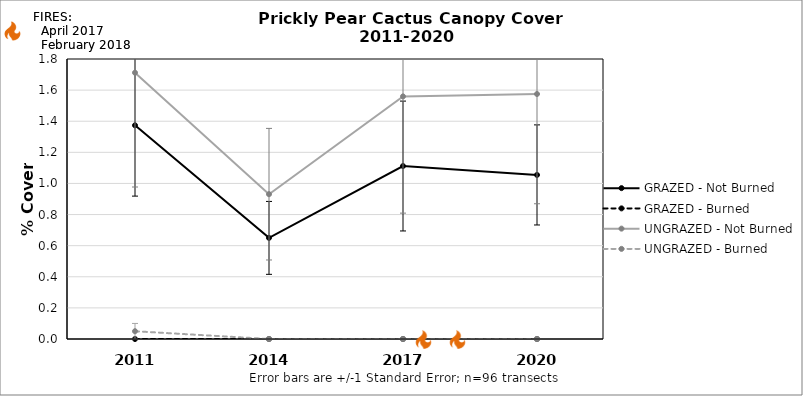
| Category | GRAZED - Not Burned | GRAZED - Burned | UNGRAZED - Not Burned | UNGRAZED - Burned |
|---|---|---|---|---|
| 2011.0 | 1.374 | 0 | 1.712 | 0.05 |
| 2014.0 | 0.65 | 0 | 0.931 | 0 |
| 2017.0 | 1.112 | 0 | 1.56 | 0 |
| 2020.0 | 1.055 | 0 | 1.575 | 0 |